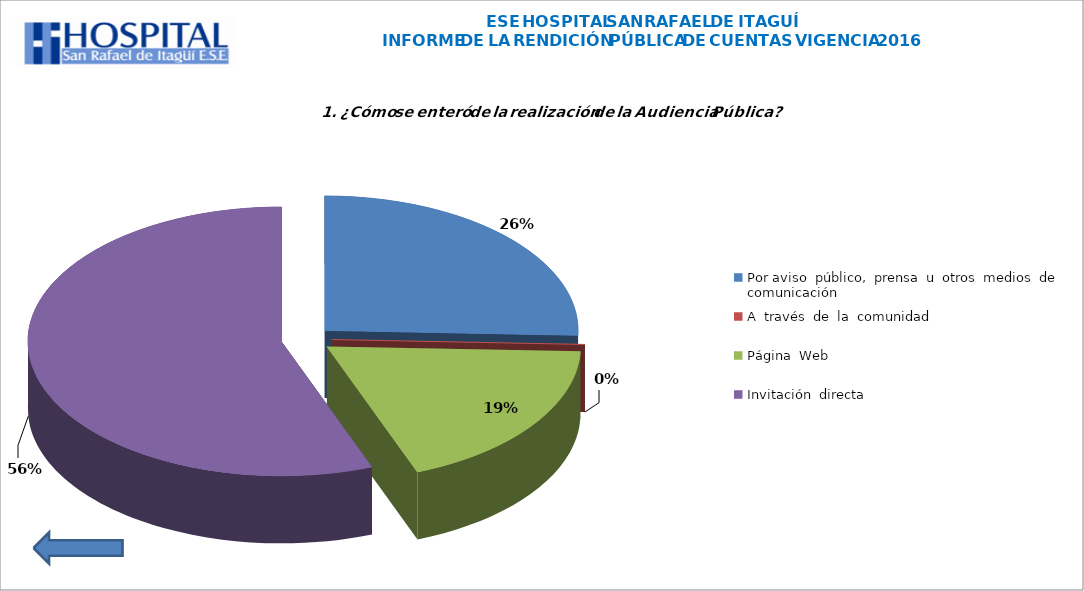
| Category | Series 0 |
|---|---|
| Por aviso  público,  prensa  u  otros  medios  de  comunicación | 11 |
| A  través  de  la  comunidad | 0 |
| Página  Web | 8 |
| Invitación  directa | 24 |